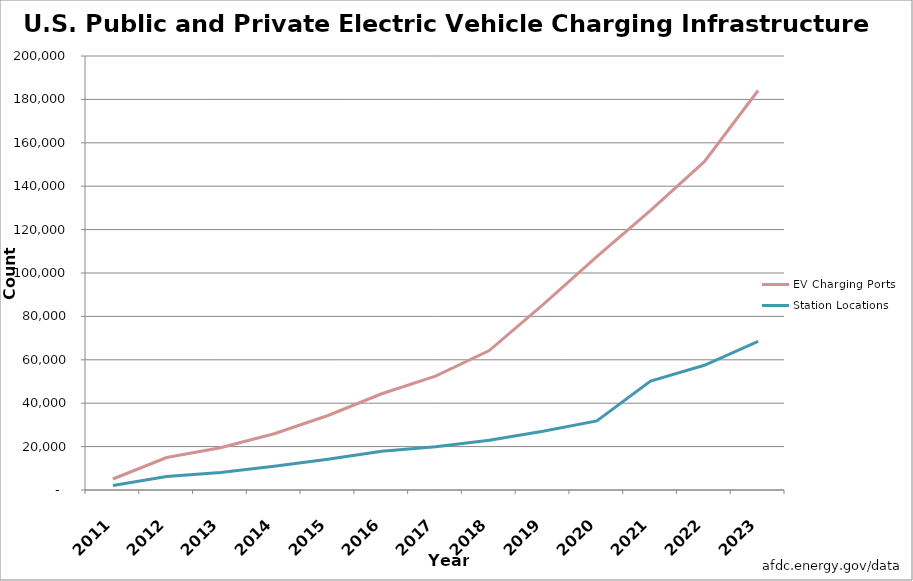
| Category |  EV Charging Ports  |  Station Locations  |
|---|---|---|
| 2011.0 | 5070 | 2100 |
| 2012.0 | 14982 | 6200 |
| 2013.0 | 19472 | 8100 |
| 2014.0 | 25944 | 10977 |
| 2015.0 | 34333 | 14138 |
| 2016.0 | 44354 | 17810 |
| 2017.0 | 52450 | 19965 |
| 2018.0 | 64249 | 22896 |
| 2019.0 | 85439 | 27031 |
| 2020.0 | 107561 | 31816 |
| 2021.0 | 128904 | 50172 |
| 2022.0 | 151273 | 57482 |
| 2023.0 | 184098 | 68475 |